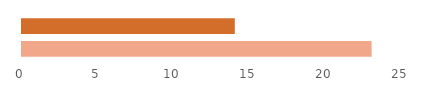
| Category | Female | Male |
|---|---|---|
| 0 | 23 | 14 |